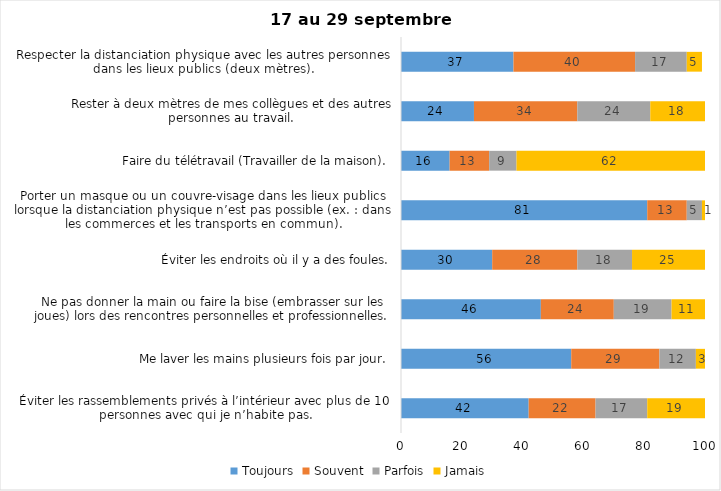
| Category | Toujours | Souvent | Parfois | Jamais |
|---|---|---|---|---|
| Éviter les rassemblements privés à l’intérieur avec plus de 10 personnes avec qui je n’habite pas. | 42 | 22 | 17 | 19 |
| Me laver les mains plusieurs fois par jour. | 56 | 29 | 12 | 3 |
| Ne pas donner la main ou faire la bise (embrasser sur les joues) lors des rencontres personnelles et professionnelles. | 46 | 24 | 19 | 11 |
| Éviter les endroits où il y a des foules. | 30 | 28 | 18 | 25 |
| Porter un masque ou un couvre-visage dans les lieux publics lorsque la distanciation physique n’est pas possible (ex. : dans les commerces et les transports en commun). | 81 | 13 | 5 | 1 |
| Faire du télétravail (Travailler de la maison). | 16 | 13 | 9 | 62 |
| Rester à deux mètres de mes collègues et des autres personnes au travail. | 24 | 34 | 24 | 18 |
| Respecter la distanciation physique avec les autres personnes dans les lieux publics (deux mètres). | 37 | 40 | 17 | 5 |